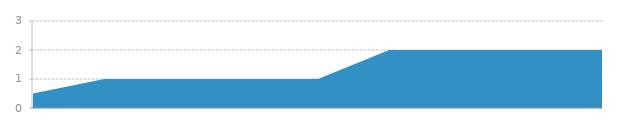
| Category | Series 0 |
|---|---|
| 0 | 0.5 |
| 1 | 1 |
| 2 | 1 |
| 3 | 1 |
| 4 | 1 |
| 5 | 2 |
| 6 | 2 |
| 7 | 2 |
| 8 | 2 |